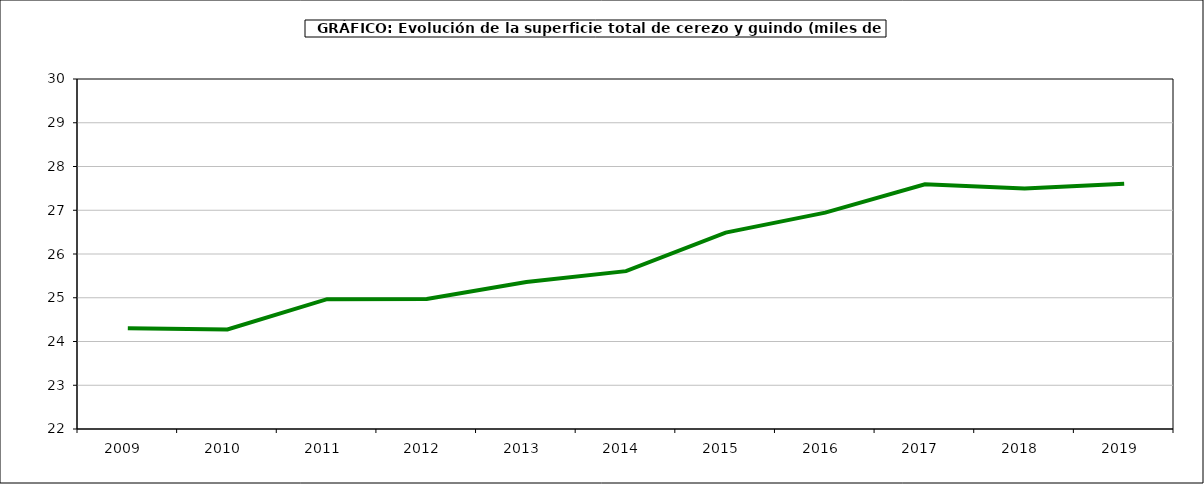
| Category | superficie cerezo y guindo |
|---|---|
| 2009.0 | 24.304 |
| 2010.0 | 24.275 |
| 2011.0 | 24.967 |
| 2012.0 | 24.972 |
| 2013.0 | 25.358 |
| 2014.0 | 25.608 |
| 2015.0 | 26.49 |
| 2016.0 | 26.946 |
| 2017.0 | 27.592 |
| 2018.0 | 27.5 |
| 2019.0 | 27.604 |